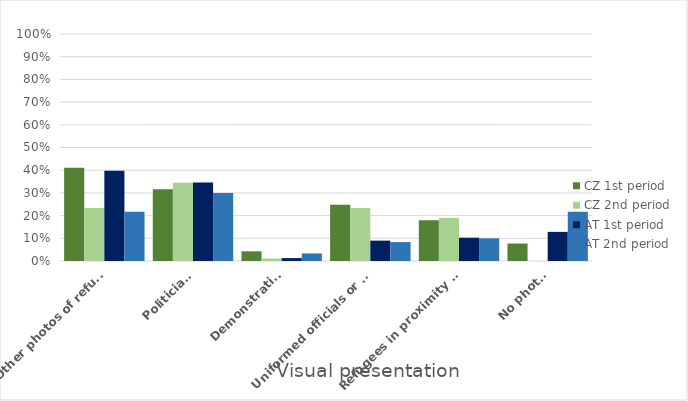
| Category | CZ 1st period | CZ 2nd period | AT 1st period | AT 2nd period |
|---|---|---|---|---|
| Other photos of refugees | 0.41 | 0.233 | 0.397 | 0.217 |
| Politicians | 0.316 | 0.344 | 0.346 | 0.3 |
| Demonstrations | 0.043 | 0.011 | 0.013 | 0.033 |
| Uniformed officials or military technique | 0.248 | 0.233 | 0.09 | 0.083 |
| Refugees in proximity of barriers and fences | 0.179 | 0.189 | 0.103 | 0.1 |
| No photos | 0.077 | 0 | 0.128 | 0.217 |